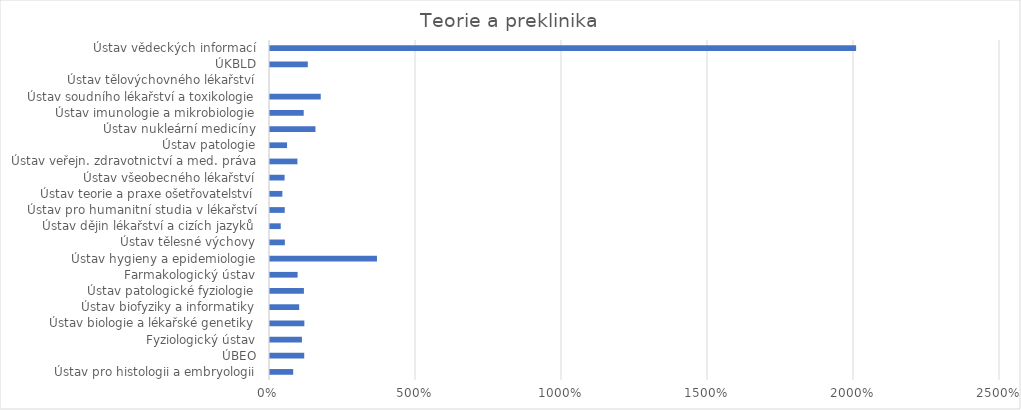
| Category | Series 0 |
|---|---|
| Ústav pro histologii a embryologii | 0.794 |
| ÚBEO | 1.172 |
| Fyziologický ústav | 1.094 |
| Ústav biologie a lékařské genetiky | 1.177 |
| Ústav biofyziky a informatiky | 1 |
| Ústav patologické fyziologie | 1.161 |
| Farmakologický ústav | 0.945 |
| Ústav hygieny a epidemiologie | 3.663 |
| Ústav tělesné výchovy | 0.509 |
| Ústav dějin lékařství a cizích jazyků | 0.367 |
| Ústav pro humanitní studia v lékařství | 0.505 |
| Ústav teorie a praxe ošetřovatelství | 0.423 |
| Ústav všeobecného lékařství | 0.499 |
| Ústav veřejn. zdravotnictví a med. práva | 0.939 |
| Ústav patologie | 0.584 |
| Ústav nukleární medicíny | 1.557 |
| Ústav imunologie a mikrobiologie | 1.154 |
| Ústav soudního lékařství a toxikologie | 1.738 |
| Ústav tělovýchovného lékařství | 0 |
| ÚKBLD | 1.295 |
| Ústav vědeckých informací | 20.072 |